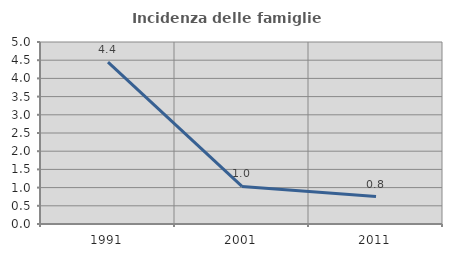
| Category | Incidenza delle famiglie numerose |
|---|---|
| 1991.0 | 4.45 |
| 2001.0 | 1.032 |
| 2011.0 | 0.753 |